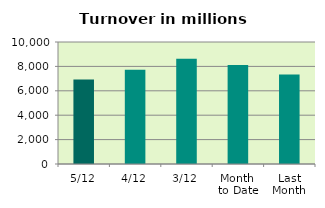
| Category | Series 0 |
|---|---|
| 5/12 | 6925.469 |
| 4/12 | 7729.003 |
| 3/12 | 8618.91 |
| Month 
to Date | 8124.003 |
| Last
Month | 7326.344 |